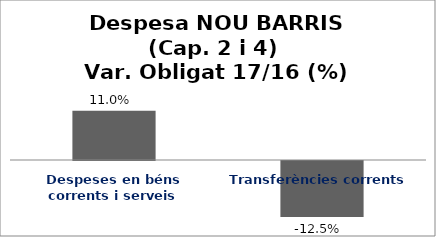
| Category | Series 0 |
|---|---|
| Despeses en béns corrents i serveis | 0.11 |
| Transferències corrents | -0.125 |